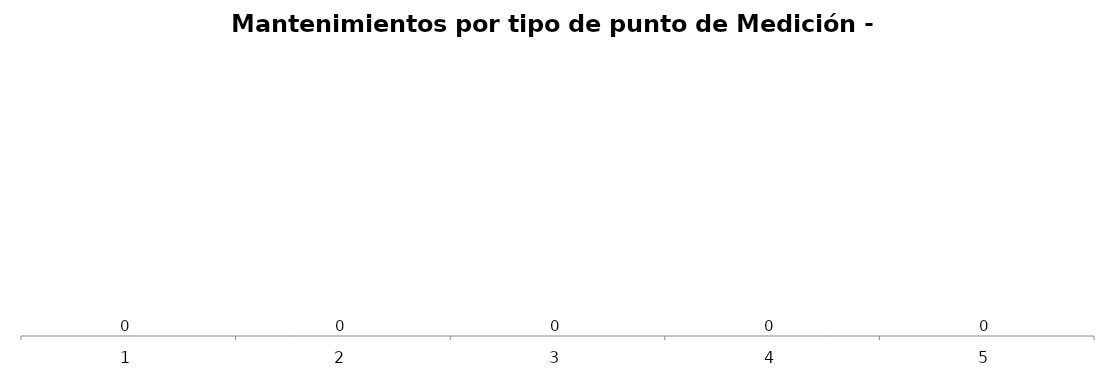
| Category | Mantenimientos por tipo de punto de Medición - Acumulado Año |
|---|---|
| 0 | 0 |
| 1 | 0 |
| 2 | 0 |
| 3 | 0 |
| 4 | 0 |